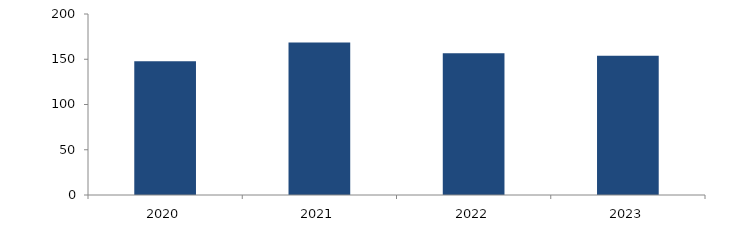
| Category | Bogotá |
|---|---|
| 2020.0 | 147.727 |
| 2021.0 | 168.609 |
| 2022.0 | 156.66 |
| 2023.0 | 153.791 |